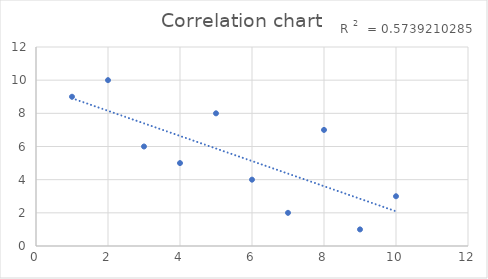
| Category | Blood presure 
(rank) |
|---|---|
| 1.0 | 9 |
| 2.0 | 10 |
| 8.0 | 7 |
| 3.0 | 6 |
| 5.0 | 8 |
| 4.0 | 5 |
| 6.0 | 4 |
| 10.0 | 3 |
| 7.0 | 2 |
| 9.0 | 1 |